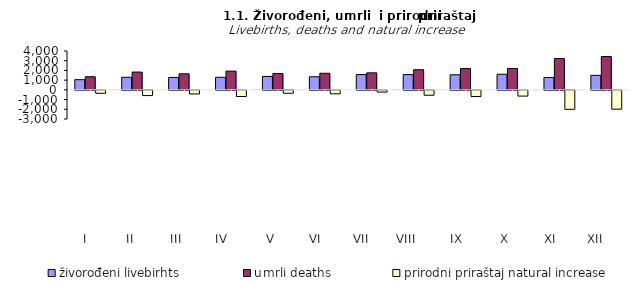
| Category | živorođeni livebirhts | umrli deaths | prirodni priraštaj natural increase |
|---|---|---|---|
| I | 1050 | 1354 | -304 |
| II | 1294 | 1830 | -536 |
| III | 1280 | 1651 | -371 |
| IV | 1295 | 1928 | -633 |
| V | 1383 | 1681 | -298 |
| VI | 1351 | 1707 | -356 |
| VII | 1574 | 1752 | -178 |
| VIII | 1570 | 2072 | -502 |
| IX | 1552 | 2190 | -638 |
| X | 1606 | 2198 | -592 |
| XI | 1268 | 3221 | -1953 |
| XII | 1493 | 3430 | -1937 |